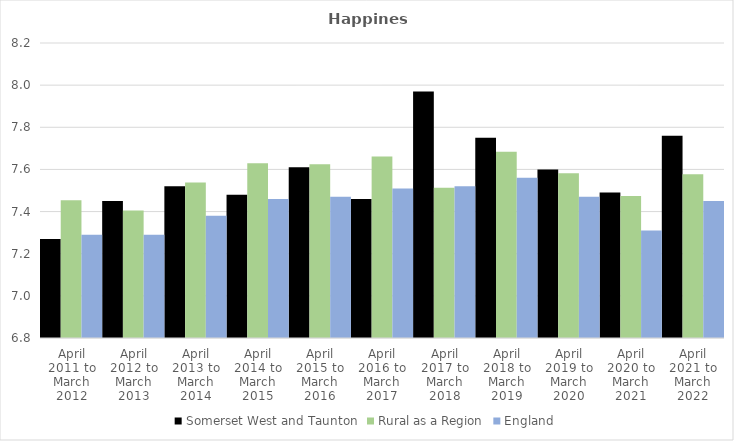
| Category | Somerset West and Taunton | Rural as a Region | England |
|---|---|---|---|
| April 2011 to March 2012 | 7.27 | 7.454 | 7.29 |
| April 2012 to March 2013 | 7.45 | 7.406 | 7.29 |
| April 2013 to March 2014 | 7.52 | 7.539 | 7.38 |
| April 2014 to March 2015 | 7.48 | 7.63 | 7.46 |
| April 2015 to March 2016 | 7.61 | 7.625 | 7.47 |
| April 2016 to March 2017 | 7.46 | 7.661 | 7.51 |
| April 2017 to March 2018 | 7.97 | 7.513 | 7.52 |
| April 2018 to March 2019 | 7.75 | 7.684 | 7.56 |
| April 2019 to March 2020 | 7.6 | 7.582 | 7.47 |
| April 2020 to March 2021 | 7.49 | 7.474 | 7.31 |
| April 2021 to March 2022 | 7.76 | 7.577 | 7.45 |